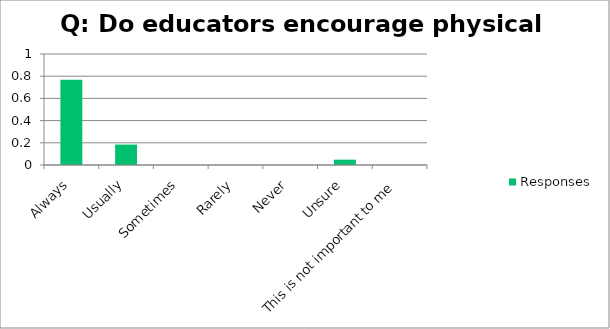
| Category | Responses |
|---|---|
| Always | 0.768 |
| Usually | 0.184 |
| Sometimes | 0 |
| Rarely | 0 |
| Never | 0 |
| Unsure | 0.048 |
| This is not important to me | 0 |